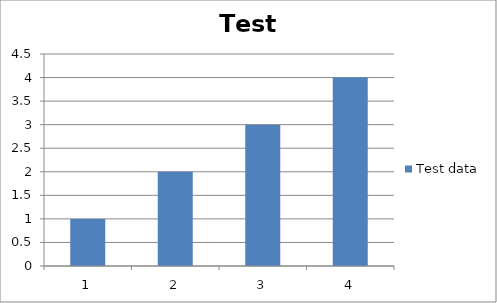
| Category | Test data |
|---|---|
| 0 | 1 |
| 1 | 2 |
| 2 | 3 |
| 3 | 4 |